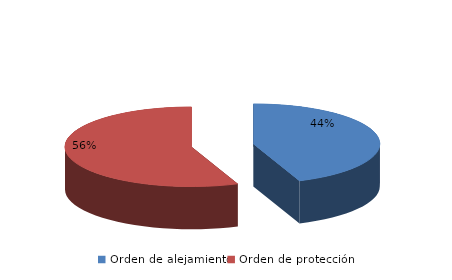
| Category | Series 0 |
|---|---|
| Orden de alejamiento | 74 |
| Orden de protección | 94 |